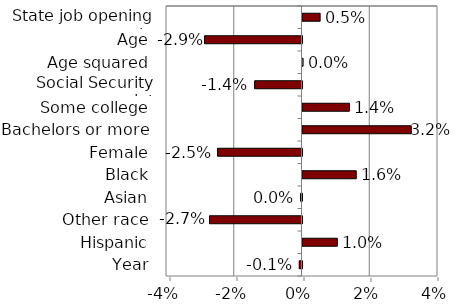
| Category | Series 0 |
|---|---|
| State job opening rate | 0.005 |
| Age | -0.029 |
| Age squared | 0 |
| Social Security receipt | -0.014 |
| Some college | 0.014 |
| Bachelors or more | 0.032 |
| Female | -0.025 |
| Black | 0.016 |
| Asian | 0 |
| Other race | -0.027 |
| Hispanic | 0.01 |
| Year | -0.001 |